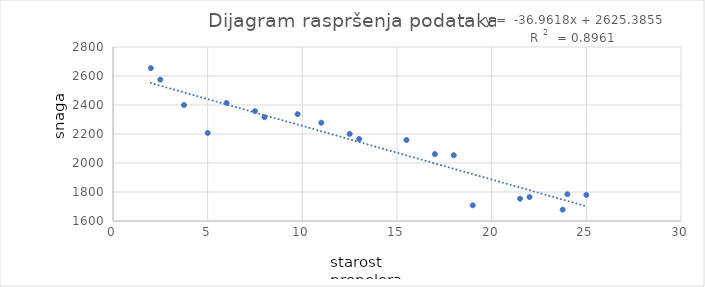
| Category | Snaga y (psi) |
|---|---|
| 15.5 | 2158.7 |
| 23.75 | 1678.15 |
| 8.0 | 2316 |
| 17.0 | 2061.3 |
| 5.0 | 2207.5 |
| 19.0 | 1708.3 |
| 24.0 | 1784.7 |
| 2.5 | 2575 |
| 7.5 | 2357.9 |
| 11.0 | 2277.7 |
| 13.0 | 2165.2 |
| 3.75 | 2399.55 |
| 25.0 | 1779.8 |
| 9.75 | 2336.75 |
| 22.0 | 1765.3 |
| 18.0 | 2053.5 |
| 6.0 | 2414.4 |
| 12.5 | 2200.5 |
| 2.0 | 2654.2 |
| 21.5 | 1753.7 |